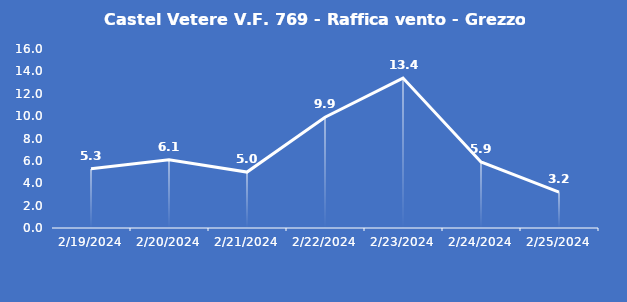
| Category | Castel Vetere V.F. 769 - Raffica vento - Grezzo (m/s) |
|---|---|
| 2/19/24 | 5.3 |
| 2/20/24 | 6.1 |
| 2/21/24 | 5 |
| 2/22/24 | 9.9 |
| 2/23/24 | 13.4 |
| 2/24/24 | 5.9 |
| 2/25/24 | 3.2 |